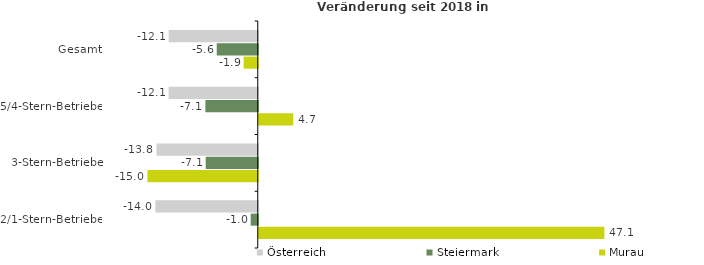
| Category | Österreich | Steiermark | Murau |
|---|---|---|---|
| Gesamt | -12.137 | -5.59 | -1.919 |
| 5/4-Stern-Betriebe | -12.15 | -7.138 | 4.693 |
| 3-Stern-Betriebe | -13.805 | -7.09 | -15.034 |
| 2/1-Stern-Betriebe | -13.951 | -0.963 | 47.107 |